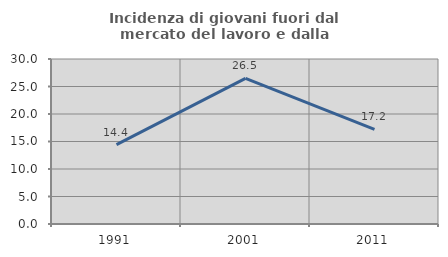
| Category | Incidenza di giovani fuori dal mercato del lavoro e dalla formazione  |
|---|---|
| 1991.0 | 14.446 |
| 2001.0 | 26.467 |
| 2011.0 | 17.211 |